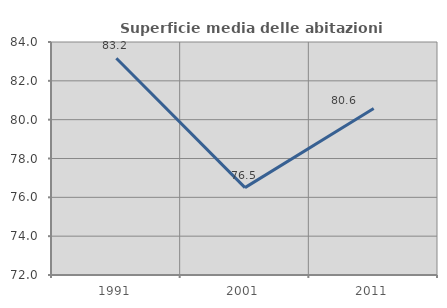
| Category | Superficie media delle abitazioni occupate |
|---|---|
| 1991.0 | 83.164 |
| 2001.0 | 76.5 |
| 2011.0 | 80.576 |